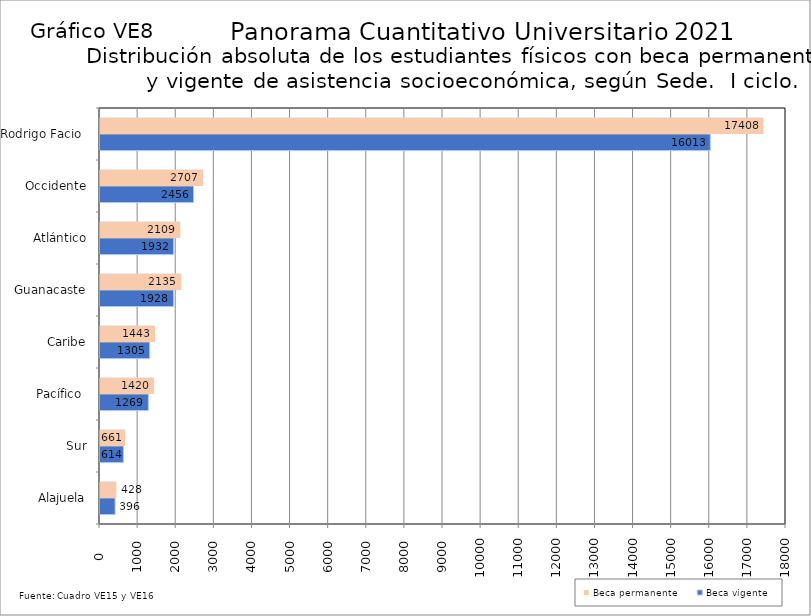
| Category | Beca vigente | Beca permanente |
|---|---|---|
| Alajuela | 396 | 428 |
| Sur | 614 | 661 |
| Pacífico  | 1269 | 1420 |
| Caribe | 1305 | 1443 |
| Guanacaste | 1928 | 2135 |
| Atlántico | 1932 | 2109 |
| Occidente | 2456 | 2707 |
| Rodrigo Facio  | 16013 | 17408 |